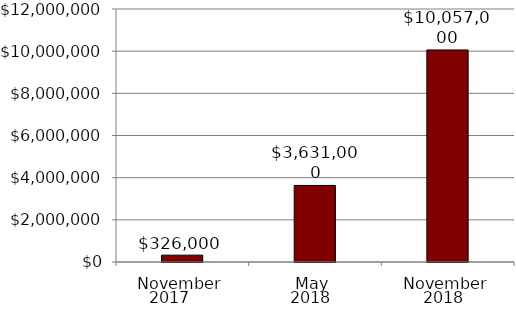
| Category | Series 0 |
|---|---|
| November | 326000 |
| May | 3631000 |
| November | 10057000 |